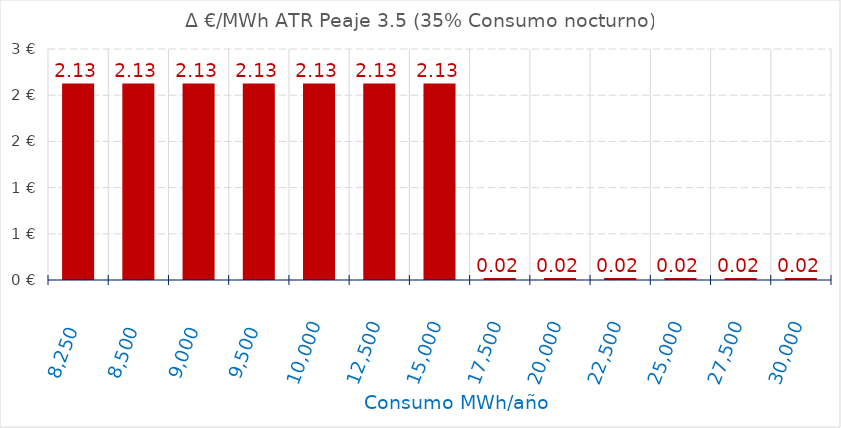
| Category | D €/MWh |
|---|---|
| 8250.0 | 2.127 |
| 8500.0 | 2.127 |
| 9000.0 | 2.127 |
| 9500.0 | 2.127 |
| 10000.0 | 2.127 |
| 12500.0 | 2.127 |
| 15000.0 | 2.127 |
| 17500.0 | 0.021 |
| 20000.0 | 0.021 |
| 22500.0 | 0.021 |
| 25000.0 | 0.021 |
| 27500.0 | 0.021 |
| 30000.0 | 0.021 |